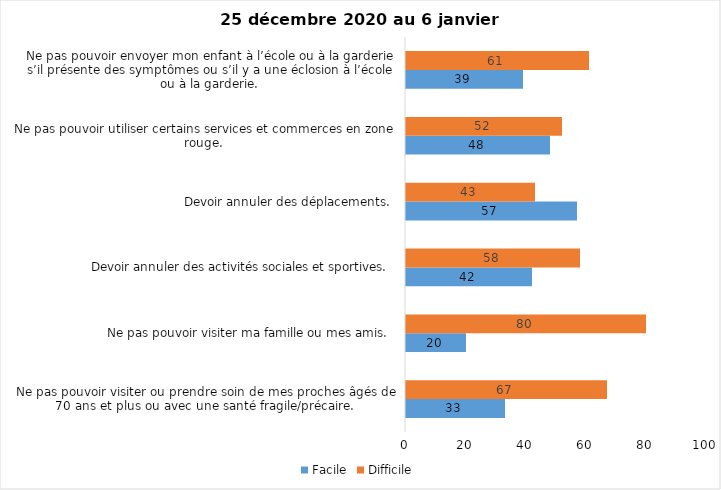
| Category | Facile | Difficile |
|---|---|---|
| Ne pas pouvoir visiter ou prendre soin de mes proches âgés de 70 ans et plus ou avec une santé fragile/précaire.  | 33 | 67 |
| Ne pas pouvoir visiter ma famille ou mes amis.  | 20 | 80 |
| Devoir annuler des activités sociales et sportives.  | 42 | 58 |
| Devoir annuler des déplacements.  | 57 | 43 |
| Ne pas pouvoir utiliser certains services et commerces en zone rouge.  | 48 | 52 |
| Ne pas pouvoir envoyer mon enfant à l’école ou à la garderie s’il présente des symptômes ou s’il y a une éclosion à l’école ou à la garderie.  | 39 | 61 |